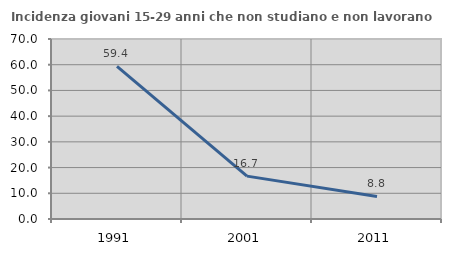
| Category | Incidenza giovani 15-29 anni che non studiano e non lavorano  |
|---|---|
| 1991.0 | 59.361 |
| 2001.0 | 16.667 |
| 2011.0 | 8.772 |